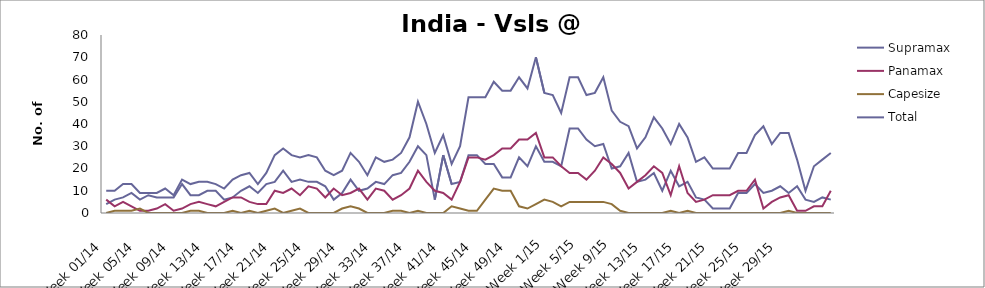
| Category | Supramax | Panamax | Capesize | Total |
|---|---|---|---|---|
| Week 01/14 | 4 | 6 | 0 | 10 |
| Week 02/14 | 6 | 3 | 1 | 10 |
| Week 03/14 | 7 | 5 | 1 | 13 |
| Week 04/14 | 9 | 3 | 1 | 13 |
| Week 05/14 | 6 | 1 | 2 | 9 |
| Week 06/14 | 8 | 1 | 0 | 9 |
| Week 07/14 | 7 | 2 | 0 | 9 |
| Week 08/14 | 7 | 4 | 0 | 11 |
| Week 09/14 | 7 | 1 | 0 | 8 |
| Week 10/14 | 13 | 2 | 0 | 15 |
| Week 11/14 | 8 | 4 | 1 | 13 |
| Week 12/14 | 8 | 5 | 1 | 14 |
| Week 13/14 | 10 | 4 | 0 | 14 |
| Week 14/14 | 10 | 3 | 0 | 13 |
| Week 15/14 | 6 | 5 | 0 | 11 |
| Week 16/14 | 7 | 7 | 1 | 15 |
| Week 17/14 | 10 | 7 | 0 | 17 |
| Week 18/14 | 12 | 5 | 1 | 18 |
| Week 19/14 | 9 | 4 | 0 | 13 |
| Week 20/14 | 13 | 4 | 1 | 18 |
| Week 21/14 | 14 | 10 | 2 | 26 |
| Week 22/14 | 19 | 9 | 0 | 29 |
| Week 23/14 | 14 | 11 | 1 | 26 |
| Week 24/14 | 15 | 8 | 2 | 25 |
| Week 25/14 | 14 | 12 | 0 | 26 |
| Week 26/14 | 14 | 11 | 0 | 25 |
| Week 27/14 | 12 | 7 | 0 | 19 |
| Week 28/14 | 6 | 11 | 0 | 17 |
| Week 29/14 | 9 | 8 | 2 | 19 |
| Week 30/14 | 15 | 9 | 3 | 27 |
| Week 31/14 | 10 | 11 | 2 | 23 |
| Week 32/14 | 11 | 6 | 0 | 17 |
| Week 33/14 | 14 | 11 | 0 | 25 |
| Week 34/14 | 13 | 10 | 0 | 23 |
| Week 35/14 | 17 | 6 | 1 | 24 |
| Week 36/14 | 18 | 8 | 1 | 27 |
| Week 37/14 | 23 | 11 | 0 | 34 |
| Week 38/14 | 30 | 19 | 1 | 50 |
| Week 39/14 | 26 | 14 | 0 | 40 |
| Week 40/14 | 6 | 10 | 0 | 27 |
| Week 41/14 | 26 | 9 | 0 | 35 |
| Week 42/14 | 13 | 6 | 3 | 22 |
| Week 43/14 | 14 | 14 | 2 | 30 |
| Week 44/14 | 26 | 25 | 1 | 52 |
| Week 45/14 | 26 | 25 | 1 | 52 |
| Week 46/14 | 22 | 24 | 6 | 52 |
| Week 47/14 | 22 | 26 | 11 | 59 |
| Week 48/14 | 16 | 29 | 10 | 55 |
| Week 49/14 | 16 | 29 | 10 | 55 |
| Week 50/14 | 25 | 33 | 3 | 61 |
| Week 51/14 | 21 | 33 | 2 | 56 |
| Week 52/14 | 30 | 36 | 4 | 70 |
| Week 1/15 | 23 | 25 | 6 | 54 |
| Week 2/15 | 23 | 25 | 5 | 53 |
| Week 3/15 | 21 | 21 | 3 | 45 |
| Week 4/15 | 38 | 18 | 5 | 61 |
| Week 5/15 | 38 | 18 | 5 | 61 |
| Week 6/15 | 33 | 15 | 5 | 53 |
| Week 7/15 | 30 | 19 | 5 | 54 |
| Week 8/15 | 31 | 25 | 5 | 61 |
| Week 9/15 | 20 | 22 | 4 | 46 |
| Week 10/15 | 21 | 18 | 1 | 41 |
| Week 11/15 | 27 | 11 | 0 | 39 |
| Week 12/15 | 14 | 14 | 0 | 29 |
| Week 13/15 | 15 | 17 | 0 | 34 |
| Week 14/15 | 18 | 21 | 0 | 43 |
| Week 15/15 | 10 | 18 | 0 | 38 |
| Week 16/15 | 19 | 8 | 1 | 31 |
| Week 17/15 | 12 | 21 | 0 | 40 |
| Week 18/15 | 14 | 9 | 1 | 34 |
| Week 19/15 | 7 | 5 | 0 | 23 |
| Week 20/15 | 6 | 6 | 0 | 25 |
| Week 21/15 | 2 | 8 | 0 | 20 |
| Week 22/15 | 2 | 8 | 0 | 20 |
| Week 23/15 | 2 | 8 | 0 | 20 |
| Week 24/15 | 9 | 10 | 0 | 27 |
| Week 25/15 | 9 | 10 | 0 | 27 |
| Week 26/15 | 13 | 15 | 0 | 35 |
| Week 27/15 | 9 | 2 | 0 | 39 |
| Week 28/15 | 10 | 5 | 0 | 31 |
| Week 29/15 | 12 | 7 | 0 | 36 |
| Week 30/15 | 9 | 8 | 1 | 36 |
| Week 31/15 | 12 | 1 | 0 | 24 |